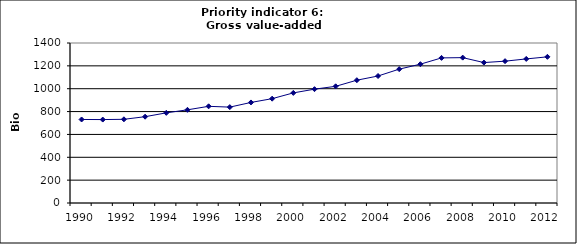
| Category | Gross value-added services, Bio Euro (EC95) |
|---|---|
| 1990 | 730.88 |
| 1991 | 729.986 |
| 1992 | 732.397 |
| 1993 | 755.152 |
| 1994 | 788.867 |
| 1995 | 815.343 |
| 1996 | 845.89 |
| 1997 | 839.043 |
| 1998 | 879.86 |
| 1999 | 912.884 |
| 2000 | 963.354 |
| 2001 | 996.11 |
| 2002 | 1020.935 |
| 2003 | 1074.579 |
| 2004 | 1111.191 |
| 2005 | 1171.249 |
| 2006 | 1214.692 |
| 2007 | 1269.579 |
| 2008 | 1271.996 |
| 2009 | 1228.774 |
| 2010 | 1241.12 |
| 2011 | 1260.566 |
| 2012 | 1278.91 |